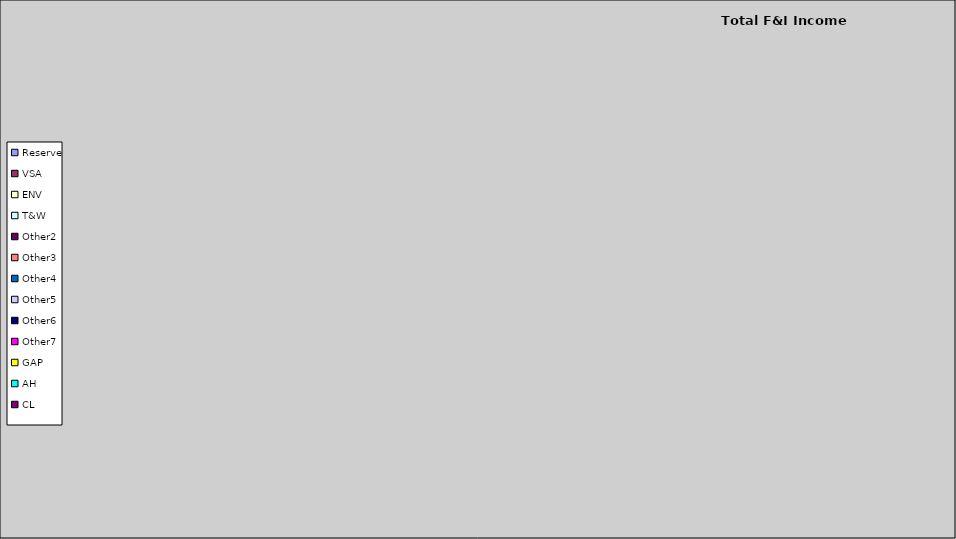
| Category | FI MIX |
|---|---|
| Reserve | 0 |
| VSA | 0 |
| ENV | 0 |
| T&W | 0 |
| Other2 | 0 |
| Other3 | 0 |
| Other4 | 0 |
| Other5 | 0 |
| Other6 | 0 |
| Other7 | 0 |
| GAP | 0 |
| AH | 0 |
| CL | 0 |